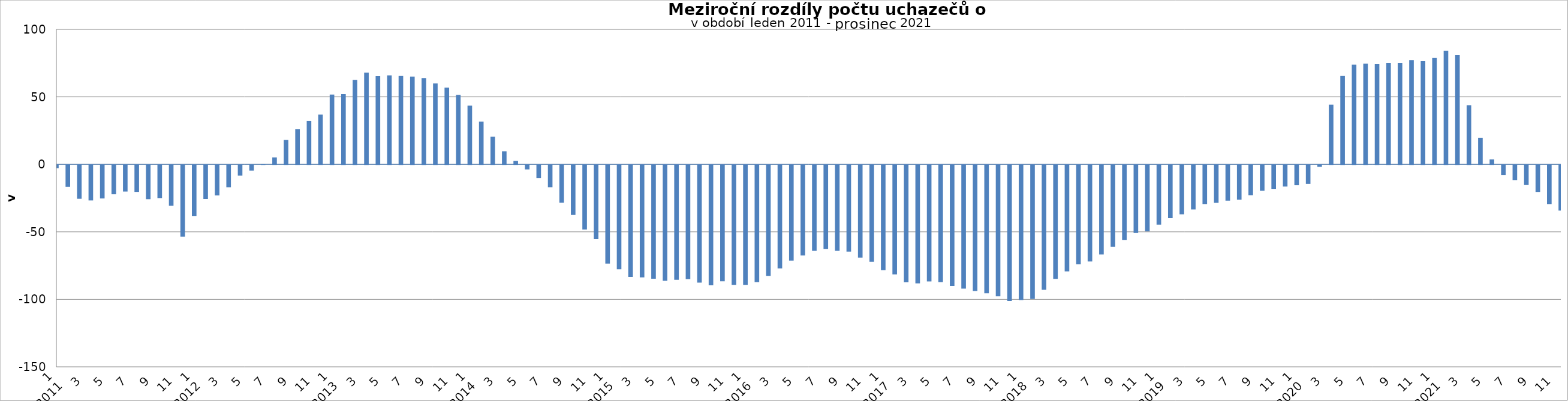
| Category | Series 1 |
|---|---|
| 0 | -2363 |
| 1 | -16239 |
| 2 | -25062 |
| 3 | -26286 |
| 4 | -24823 |
| 5 | -21725 |
| 6 | -19700 |
| 7 | -19959 |
| 8 | -25366 |
| 9 | -24543 |
| 10 | -30236 |
| 11 | -53100 |
| 12 | -37774 |
| 13 | -25211 |
| 14 | -22582 |
| 15 | -16520 |
| 16 | -7857 |
| 17 | -4189 |
| 18 | 13 |
| 19 | 5158 |
| 20 | 18070 |
| 21 | 26144 |
| 22 | 32094 |
| 23 | 36860 |
| 24 | 51720 |
| 25 | 51998 |
| 26 | 62588 |
| 27 | 67906 |
| 28 | 65364 |
| 29 | 65887 |
| 30 | 65499 |
| 31 | 65038 |
| 32 | 63873 |
| 33 | 59919 |
| 34 | 56815 |
| 35 | 51522 |
| 36 | 43465 |
| 37 | 31707 |
| 38 | 20547 |
| 39 | 9680 |
| 40 | 2510 |
| 41 | -3294 |
| 42 | -9732 |
| 43 | -16506 |
| 44 | -27960 |
| 45 | -37043 |
| 46 | -47805 |
| 47 | -54919 |
| 48 | -73083 |
| 49 | -77273 |
| 50 | -83000 |
| 51 | -83323 |
| 52 | -84284 |
| 53 | -85784 |
| 54 | -85023 |
| 55 | -84559 |
| 56 | -87206 |
| 57 | -89206 |
| 58 | -86144 |
| 59 | -88796 |
| 60 | -88788 |
| 61 | -86863 |
| 62 | -82206 |
| 63 | -76625 |
| 64 | -70900 |
| 65 | -67067 |
| 66 | -63674 |
| 67 | -62192 |
| 68 | -63634 |
| 69 | -64188 |
| 70 | -68609 |
| 71 | -71745 |
| 72 | -77987 |
| 73 | -81046 |
| 74 | -86997 |
| 75 | -87761 |
| 76 | -86268 |
| 77 | -86889 |
| 78 | -89593 |
| 79 | -91648 |
| 80 | -93343 |
| 81 | -95071 |
| 82 | -97286 |
| 83 | -100753 |
| 84 | -100188 |
| 85 | -99309 |
| 86 | -92504 |
| 87 | -84401 |
| 88 | -78889 |
| 89 | -73653 |
| 90 | -71509 |
| 91 | -66327 |
| 92 | -60584 |
| 93 | -55551 |
| 94 | -50459 |
| 95 | -49086 |
| 96 | -44171 |
| 97 | -39482 |
| 98 | -36555 |
| 99 | -32970 |
| 100 | -28957 |
| 101 | -28063 |
| 102 | -26445 |
| 103 | -25710 |
| 104 | -22424 |
| 105 | -19104 |
| 106 | -17721 |
| 107 | -16002 |
| 108 | -15035 |
| 109 | -14048 |
| 110 | -1375 |
| 111 | 44212 |
| 112 | 65469 |
| 113 | 73914 |
| 114 | 74553 |
| 115 | 74289 |
| 116 | 75108 |
| 117 | 75167 |
| 118 | 77237 |
| 119 | 76445 |
| 120 | 78837 |
| 121 | 84094 |
| 122 | 80938 |
| 123 | 43836 |
| 124 | 19678 |
| 125 | 3665 |
| 126 | -7495 |
| 127 | -11189 |
| 128 | -14873 |
| 129 | -19996 |
| 130 | -28977 |
| 131 | -33804 |